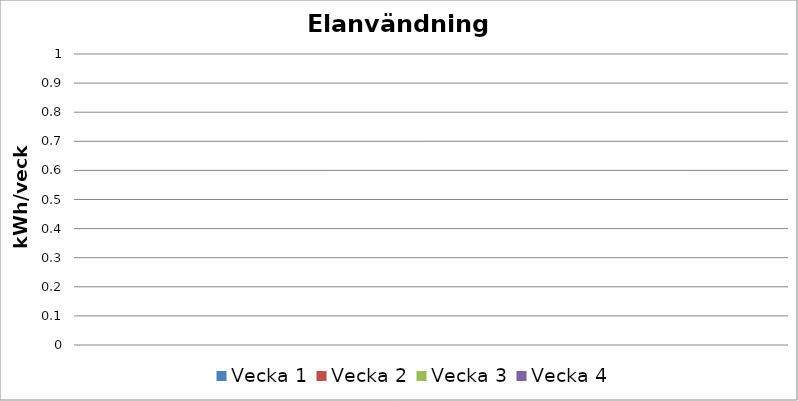
| Category | Vecka 1 | Vecka 2 | Vecka 3 | Vecka 4 |
|---|---|---|---|---|
| 0 | 0 | 0 | 0 | 0 |